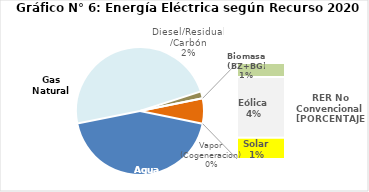
| Category | Series 0 |
|---|---|
| Agua | 1989.378 |
| Gas Natural | 2192.725 |
| Diesel/Residual/Carbón | 80.522 |
| Vapor (Cogeneracion) | 0.23 |
| Biomasa (BZ+BG) | 42.207 |
| Eólica | 184.272 |
| Solar | 64.289 |